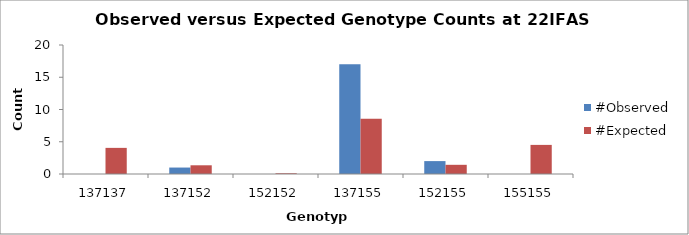
| Category | #Observed | #Expected |
|---|---|---|
| 137137.0 | 0 | 4.05 |
| 137152.0 | 1 | 1.35 |
| 152152.0 | 0 | 0.112 |
| 137155.0 | 17 | 8.55 |
| 152155.0 | 2 | 1.425 |
| 155155.0 | 0 | 4.512 |